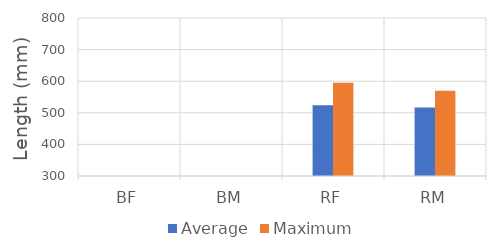
| Category | Average | Maximum |
|---|---|---|
| BF | 0 | 0 |
| BM | 0 | 0 |
| RF | 524 | 595 |
| RM | 516.618 | 570 |